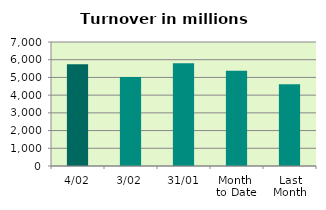
| Category | Series 0 |
|---|---|
| 4/02 | 5737.793 |
| 3/02 | 5023.231 |
| 31/01 | 5804.523 |
| Month 
to Date | 5380.512 |
| Last
Month | 4609.616 |